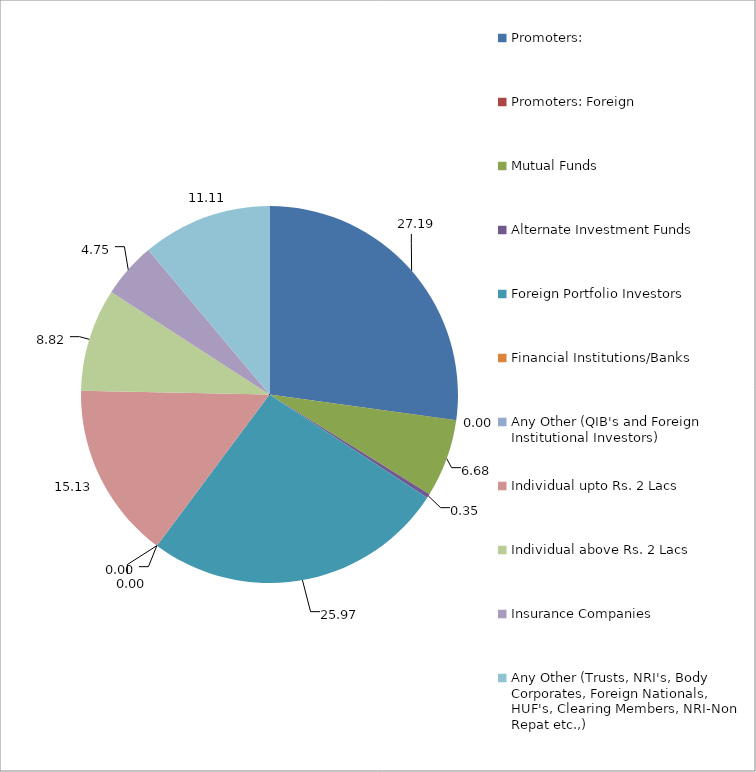
| Category | Series 0 |
|---|---|
| Promoters: | 27.19 |
| Promoters: Foreign | 0 |
| Mutual Funds | 6.68 |
| Alternate Investment Funds | 0.35 |
| Foreign Portfolio Investors | 25.97 |
| Financial Institutions/Banks | 0 |
| Any Other (QIB's and Foreign Institutional Investors) | 0 |
| Individual upto Rs. 2 Lacs | 15.13 |
| Individual above Rs. 2 Lacs | 8.82 |
| Insurance Companies | 4.75 |
| Any Other (Trusts, NRI's, Body Corporates, Foreign Nationals, HUF's, Clearing Members, NRI-Non Repat etc.,) | 11.11 |